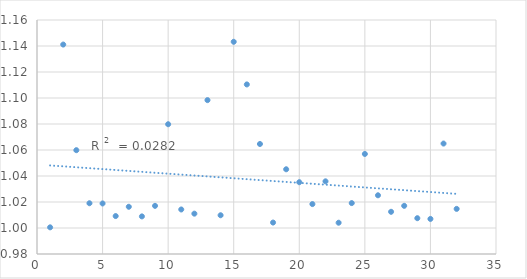
| Category | Series 0 |
|---|---|
| 1.0 | 1.001 |
| 2.0 | 1.141 |
| 3.0 | 1.06 |
| 4.0 | 1.019 |
| 5.0 | 1.019 |
| 6.0 | 1.009 |
| 7.0 | 1.016 |
| 8.0 | 1.009 |
| 9.0 | 1.017 |
| 10.0 | 1.08 |
| 11.0 | 1.014 |
| 12.0 | 1.011 |
| 13.0 | 1.098 |
| 14.0 | 1.01 |
| 15.0 | 1.143 |
| 16.0 | 1.11 |
| 17.0 | 1.065 |
| 18.0 | 1.004 |
| 19.0 | 1.045 |
| 20.0 | 1.035 |
| 21.0 | 1.018 |
| 22.0 | 1.036 |
| 23.0 | 1.004 |
| 24.0 | 1.019 |
| 25.0 | 1.057 |
| 26.0 | 1.025 |
| 27.0 | 1.012 |
| 28.0 | 1.017 |
| 29.0 | 1.008 |
| 30.0 | 1.007 |
| 31.0 | 1.065 |
| 32.0 | 1.015 |